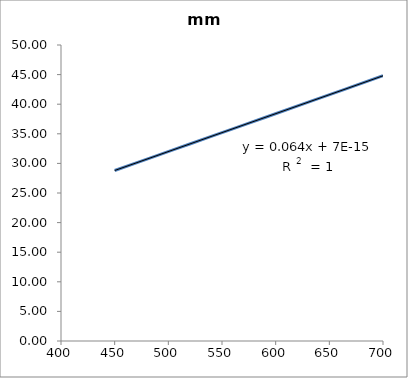
| Category | mm |
|---|---|
| 700.0 | 44.8 |
| 635.0 | 40.64 |
| 590.0 | 37.76 |
| 560.0 | 35.84 |
| 520.0 | 33.28 |
| 490.0 | 31.36 |
| 450.0 | 28.8 |